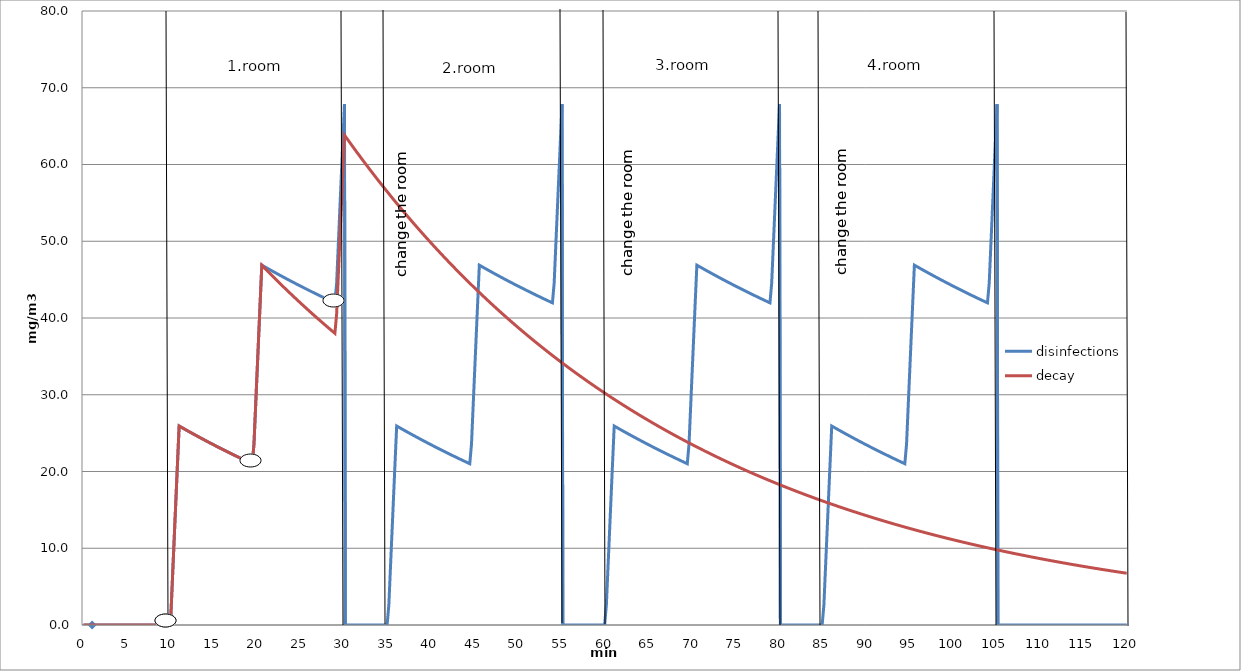
| Category | disinfections | decay |
|---|---|---|
| 0.0 | 0 | 0 |
| 0.1 | 0 | 0 |
| 0.2 | 0 | 0 |
| 0.30000000000000004 | 0 | 0 |
| 0.4 | 0 | 0 |
| 0.5 | 0 | 0 |
| 0.6 | 0 | 0 |
| 0.7 | 0 | 0 |
| 0.7999999999999999 | 0 | 0 |
| 0.8999999999999999 | 0 | 0 |
| 0.9999999999999999 | 0 | 0 |
| 1.0999999999999999 | 0 | 0 |
| 1.2 | 0 | 0 |
| 1.3 | 0 | 0 |
| 1.4000000000000001 | 0 | 0 |
| 1.5000000000000002 | 0 | 0 |
| 1.6000000000000003 | 0 | 0 |
| 1.7000000000000004 | 0 | 0 |
| 1.8000000000000005 | 0 | 0 |
| 1.9000000000000006 | 0 | 0 |
| 2.0000000000000004 | 0 | 0 |
| 2.1000000000000005 | 0 | 0 |
| 2.2000000000000006 | 0 | 0 |
| 2.3000000000000007 | 0 | 0 |
| 2.400000000000001 | 0 | 0 |
| 2.500000000000001 | 0 | 0 |
| 2.600000000000001 | 0 | 0 |
| 2.700000000000001 | 0 | 0 |
| 2.800000000000001 | 0 | 0 |
| 2.9000000000000012 | 0 | 0 |
| 3.0000000000000013 | 0 | 0 |
| 3.1000000000000014 | 0 | 0 |
| 3.2000000000000015 | 0 | 0 |
| 3.3000000000000016 | 0 | 0 |
| 3.4000000000000017 | 0 | 0 |
| 3.5000000000000018 | 0 | 0 |
| 3.600000000000002 | 0 | 0 |
| 3.700000000000002 | 0 | 0 |
| 3.800000000000002 | 0 | 0 |
| 3.900000000000002 | 0 | 0 |
| 4.000000000000002 | 0 | 0 |
| 4.100000000000001 | 0 | 0 |
| 4.200000000000001 | 0 | 0 |
| 4.300000000000001 | 0 | 0 |
| 4.4 | 0 | 0 |
| 4.5 | 0 | 0 |
| 4.6 | 0 | 0 |
| 4.699999999999999 | 0 | 0 |
| 4.799999999999999 | 0 | 0 |
| 4.899999999999999 | 0 | 0 |
| 4.999999999999998 | 0 | 0 |
| 5.099999999999998 | 0 | 0 |
| 5.1999999999999975 | 0 | 0 |
| 5.299999999999997 | 0 | 0 |
| 5.399999999999997 | 0 | 0 |
| 5.4999999999999964 | 0 | 0 |
| 5.599999999999996 | 0 | 0 |
| 5.699999999999996 | 0 | 0 |
| 5.799999999999995 | 0 | 0 |
| 5.899999999999995 | 0 | 0 |
| 5.999999999999995 | 0 | 0 |
| 6.099999999999994 | 0 | 0 |
| 6.199999999999994 | 0 | 0 |
| 6.299999999999994 | 0 | 0 |
| 6.399999999999993 | 0 | 0 |
| 6.499999999999993 | 0 | 0 |
| 6.5999999999999925 | 0 | 0 |
| 6.699999999999992 | 0 | 0 |
| 6.799999999999992 | 0 | 0 |
| 6.8999999999999915 | 0 | 0 |
| 6.999999999999991 | 0 | 0 |
| 7.099999999999991 | 0 | 0 |
| 7.19999999999999 | 0 | 0 |
| 7.29999999999999 | 0 | 0 |
| 7.39999999999999 | 0 | 0 |
| 7.499999999999989 | 0 | 0 |
| 7.599999999999989 | 0 | 0 |
| 7.699999999999989 | 0 | 0 |
| 7.799999999999988 | 0 | 0 |
| 7.899999999999988 | 0 | 0 |
| 7.999999999999988 | 0 | 0 |
| 8.099999999999987 | 0 | 0 |
| 8.199999999999987 | 0 | 0 |
| 8.299999999999986 | 0 | 0 |
| 8.399999999999986 | 0 | 0 |
| 8.499999999999986 | 0 | 0 |
| 8.599999999999985 | 0 | 0 |
| 8.699999999999985 | 0 | 0 |
| 8.799999999999985 | 0 | 0 |
| 8.899999999999984 | 0 | 0 |
| 8.999999999999984 | 0 | 0 |
| 9.099999999999984 | 0 | 0 |
| 9.199999999999983 | 0 | 0 |
| 9.299999999999983 | 0 | 0 |
| 9.399999999999983 | 0 | 0 |
| 9.499999999999982 | 0 | 0 |
| 9.599999999999982 | 0 | 0 |
| 9.699999999999982 | 0 | 0 |
| 9.799999999999981 | 0 | 0 |
| 9.89999999999998 | 0 | 0 |
| 9.99999999999998 | 0 | 0 |
| 10.09999999999998 | 2.622 | 2.622 |
| 10.19999999999998 | 5.237 | 5.237 |
| 10.29999999999998 | 7.846 | 7.846 |
| 10.399999999999979 | 10.448 | 10.448 |
| 10.499999999999979 | 13.043 | 13.043 |
| 10.599999999999978 | 15.632 | 15.632 |
| 10.699999999999978 | 18.215 | 18.215 |
| 10.799999999999978 | 20.791 | 20.791 |
| 10.899999999999977 | 23.361 | 23.361 |
| 10.999999999999977 | 25.925 | 25.925 |
| 11.099999999999977 | 25.86 | 25.86 |
| 11.199999999999976 | 25.795 | 25.795 |
| 11.299999999999976 | 25.731 | 25.731 |
| 11.399999999999975 | 25.667 | 25.667 |
| 11.499999999999975 | 25.603 | 25.603 |
| 11.599999999999975 | 25.539 | 25.539 |
| 11.699999999999974 | 25.475 | 25.475 |
| 11.799999999999974 | 25.411 | 25.411 |
| 11.899999999999974 | 25.348 | 25.348 |
| 11.999999999999973 | 25.285 | 25.285 |
| 12.099999999999973 | 25.221 | 25.221 |
| 12.199999999999973 | 25.158 | 25.158 |
| 12.299999999999972 | 25.096 | 25.096 |
| 12.399999999999972 | 25.033 | 25.033 |
| 12.499999999999972 | 24.97 | 24.97 |
| 12.599999999999971 | 24.908 | 24.908 |
| 12.69999999999997 | 24.846 | 24.846 |
| 12.79999999999997 | 24.784 | 24.784 |
| 12.89999999999997 | 24.722 | 24.722 |
| 12.99999999999997 | 24.66 | 24.66 |
| 13.09999999999997 | 24.599 | 24.599 |
| 13.199999999999969 | 24.537 | 24.537 |
| 13.299999999999969 | 24.476 | 24.476 |
| 13.399999999999968 | 24.415 | 24.415 |
| 13.499999999999968 | 24.354 | 24.354 |
| 13.599999999999968 | 24.293 | 24.293 |
| 13.699999999999967 | 24.232 | 24.232 |
| 13.799999999999967 | 24.172 | 24.172 |
| 13.899999999999967 | 24.112 | 24.112 |
| 13.999999999999966 | 24.051 | 24.051 |
| 14.099999999999966 | 23.991 | 23.991 |
| 14.199999999999966 | 23.931 | 23.931 |
| 14.299999999999965 | 23.872 | 23.872 |
| 14.399999999999965 | 23.812 | 23.812 |
| 14.499999999999964 | 23.753 | 23.753 |
| 14.599999999999964 | 23.693 | 23.693 |
| 14.699999999999964 | 23.634 | 23.634 |
| 14.799999999999963 | 23.575 | 23.575 |
| 14.899999999999963 | 23.516 | 23.516 |
| 14.999999999999963 | 23.458 | 23.458 |
| 15.099999999999962 | 23.399 | 23.399 |
| 15.199999999999962 | 23.341 | 23.341 |
| 15.299999999999962 | 23.282 | 23.282 |
| 15.399999999999961 | 23.224 | 23.224 |
| 15.499999999999961 | 23.166 | 23.166 |
| 15.59999999999996 | 23.108 | 23.108 |
| 15.69999999999996 | 23.051 | 23.051 |
| 15.79999999999996 | 22.993 | 22.993 |
| 15.89999999999996 | 22.936 | 22.936 |
| 15.99999999999996 | 22.878 | 22.878 |
| 16.09999999999996 | 22.821 | 22.821 |
| 16.19999999999996 | 22.764 | 22.764 |
| 16.29999999999996 | 22.707 | 22.707 |
| 16.399999999999963 | 22.651 | 22.651 |
| 16.499999999999964 | 22.594 | 22.594 |
| 16.599999999999966 | 22.538 | 22.538 |
| 16.699999999999967 | 22.481 | 22.481 |
| 16.79999999999997 | 22.425 | 22.425 |
| 16.89999999999997 | 22.369 | 22.369 |
| 16.99999999999997 | 22.314 | 22.314 |
| 17.099999999999973 | 22.258 | 22.258 |
| 17.199999999999974 | 22.202 | 22.202 |
| 17.299999999999976 | 22.147 | 22.147 |
| 17.399999999999977 | 22.091 | 22.091 |
| 17.49999999999998 | 22.036 | 22.036 |
| 17.59999999999998 | 21.981 | 21.981 |
| 17.69999999999998 | 21.926 | 21.926 |
| 17.799999999999983 | 21.872 | 21.872 |
| 17.899999999999984 | 21.817 | 21.817 |
| 17.999999999999986 | 21.763 | 21.763 |
| 18.099999999999987 | 21.708 | 21.708 |
| 18.19999999999999 | 21.654 | 21.654 |
| 18.29999999999999 | 21.6 | 21.6 |
| 18.39999999999999 | 21.546 | 21.546 |
| 18.499999999999993 | 21.492 | 21.492 |
| 18.599999999999994 | 21.439 | 21.439 |
| 18.699999999999996 | 21.385 | 21.385 |
| 18.799999999999997 | 21.332 | 21.332 |
| 18.9 | 21.278 | 21.278 |
| 19.0 | 21.225 | 21.225 |
| 19.1 | 21.172 | 21.172 |
| 19.200000000000003 | 21.119 | 21.119 |
| 19.300000000000004 | 21.067 | 21.067 |
| 19.400000000000006 | 21.014 | 21.014 |
| 19.500000000000007 | 20.962 | 20.962 |
| 19.60000000000001 | 23.583 | 23.583 |
| 19.70000000000001 | 26.198 | 26.198 |
| 19.80000000000001 | 28.807 | 28.807 |
| 19.900000000000013 | 31.409 | 31.409 |
| 20.000000000000014 | 34.005 | 34.005 |
| 20.100000000000016 | 36.594 | 36.594 |
| 20.200000000000017 | 39.177 | 39.177 |
| 20.30000000000002 | 41.753 | 41.753 |
| 20.40000000000002 | 44.323 | 44.323 |
| 20.50000000000002 | 46.886 | 46.886 |
| 20.600000000000023 | 46.821 | 46.769 |
| 20.700000000000024 | 46.757 | 46.652 |
| 20.800000000000026 | 46.692 | 46.536 |
| 20.900000000000027 | 46.628 | 46.42 |
| 21.00000000000003 | 46.564 | 46.304 |
| 21.10000000000003 | 46.5 | 46.188 |
| 21.20000000000003 | 46.436 | 46.073 |
| 21.300000000000033 | 46.373 | 45.958 |
| 21.400000000000034 | 46.309 | 45.843 |
| 21.500000000000036 | 46.246 | 45.729 |
| 21.600000000000037 | 46.183 | 45.614 |
| 21.70000000000004 | 46.12 | 45.5 |
| 21.80000000000004 | 46.057 | 45.387 |
| 21.90000000000004 | 45.995 | 45.274 |
| 22.000000000000043 | 45.932 | 45.161 |
| 22.100000000000044 | 45.87 | 45.048 |
| 22.200000000000045 | 45.807 | 44.935 |
| 22.300000000000047 | 45.745 | 44.823 |
| 22.40000000000005 | 45.684 | 44.711 |
| 22.50000000000005 | 45.622 | 44.6 |
| 22.60000000000005 | 45.56 | 44.488 |
| 22.700000000000053 | 45.499 | 44.377 |
| 22.800000000000054 | 45.438 | 44.266 |
| 22.900000000000055 | 45.376 | 44.156 |
| 23.000000000000057 | 45.315 | 44.045 |
| 23.10000000000006 | 45.255 | 43.936 |
| 23.20000000000006 | 45.194 | 43.826 |
| 23.30000000000006 | 45.134 | 43.716 |
| 23.400000000000063 | 45.073 | 43.607 |
| 23.500000000000064 | 45.013 | 43.498 |
| 23.600000000000065 | 44.953 | 43.39 |
| 23.700000000000067 | 44.893 | 43.281 |
| 23.800000000000068 | 44.833 | 43.173 |
| 23.90000000000007 | 44.774 | 43.066 |
| 24.00000000000007 | 44.714 | 42.958 |
| 24.100000000000072 | 44.655 | 42.851 |
| 24.200000000000074 | 44.596 | 42.744 |
| 24.300000000000075 | 44.537 | 42.637 |
| 24.400000000000077 | 44.478 | 42.531 |
| 24.500000000000078 | 44.419 | 42.424 |
| 24.60000000000008 | 44.361 | 42.318 |
| 24.70000000000008 | 44.302 | 42.213 |
| 24.800000000000082 | 44.244 | 42.107 |
| 24.900000000000084 | 44.186 | 42.002 |
| 25.000000000000085 | 44.128 | 41.897 |
| 25.100000000000087 | 44.07 | 41.793 |
| 25.200000000000088 | 44.012 | 41.688 |
| 25.30000000000009 | 43.955 | 41.584 |
| 25.40000000000009 | 43.897 | 41.48 |
| 25.500000000000092 | 43.84 | 41.377 |
| 25.600000000000094 | 43.783 | 41.274 |
| 25.700000000000095 | 43.726 | 41.171 |
| 25.800000000000097 | 43.669 | 41.068 |
| 25.900000000000098 | 43.612 | 40.965 |
| 26.0000000000001 | 43.556 | 40.863 |
| 26.1000000000001 | 43.499 | 40.761 |
| 26.200000000000102 | 43.443 | 40.659 |
| 26.300000000000104 | 43.387 | 40.558 |
| 26.400000000000105 | 43.331 | 40.456 |
| 26.500000000000107 | 43.275 | 40.355 |
| 26.600000000000108 | 43.219 | 40.255 |
| 26.70000000000011 | 43.164 | 40.154 |
| 26.80000000000011 | 43.108 | 40.054 |
| 26.900000000000112 | 43.053 | 39.954 |
| 27.000000000000114 | 42.998 | 39.854 |
| 27.100000000000115 | 42.943 | 39.755 |
| 27.200000000000117 | 42.888 | 39.655 |
| 27.300000000000118 | 42.833 | 39.556 |
| 27.40000000000012 | 42.779 | 39.457 |
| 27.50000000000012 | 42.724 | 39.359 |
| 27.600000000000122 | 42.67 | 39.261 |
| 27.700000000000124 | 42.616 | 39.163 |
| 27.800000000000125 | 42.562 | 39.065 |
| 27.900000000000126 | 42.508 | 38.967 |
| 28.000000000000128 | 42.454 | 38.87 |
| 28.10000000000013 | 42.4 | 38.773 |
| 28.20000000000013 | 42.347 | 38.676 |
| 28.300000000000132 | 42.293 | 38.58 |
| 28.400000000000134 | 42.24 | 38.483 |
| 28.500000000000135 | 42.187 | 38.387 |
| 28.600000000000136 | 42.134 | 38.291 |
| 28.700000000000138 | 42.081 | 38.196 |
| 28.80000000000014 | 42.028 | 38.1 |
| 28.90000000000014 | 41.976 | 38.005 |
| 29.000000000000142 | 41.923 | 37.91 |
| 29.100000000000144 | 44.545 | 40.532 |
| 29.200000000000145 | 47.16 | 43.147 |
| 29.300000000000146 | 49.769 | 45.756 |
| 29.400000000000148 | 52.371 | 48.358 |
| 29.50000000000015 | 54.967 | 50.954 |
| 29.60000000000015 | 57.556 | 53.543 |
| 29.700000000000152 | 60.138 | 56.125 |
| 29.800000000000153 | 62.715 | 58.702 |
| 29.900000000000155 | 65.284 | 61.272 |
| 30.000000000000156 | 67.848 | 63.835 |
| 30.100000000000158 | 0 | 63.676 |
| 30.20000000000016 | 0 | 63.517 |
| 30.30000000000016 | 0 | 63.358 |
| 30.400000000000162 | 0 | 63.2 |
| 30.500000000000163 | 0 | 63.042 |
| 30.600000000000165 | 0 | 62.885 |
| 30.700000000000166 | 0 | 62.728 |
| 30.800000000000168 | 0 | 62.571 |
| 30.90000000000017 | 0 | 62.415 |
| 31.00000000000017 | 0 | 62.259 |
| 31.100000000000172 | 0 | 62.103 |
| 31.200000000000173 | 0 | 61.948 |
| 31.300000000000175 | 0 | 61.794 |
| 31.400000000000176 | 0 | 61.639 |
| 31.500000000000178 | 0 | 61.485 |
| 31.60000000000018 | 0 | 61.332 |
| 31.70000000000018 | 0 | 61.179 |
| 31.800000000000182 | 0 | 61.026 |
| 31.900000000000183 | 0 | 60.874 |
| 32.000000000000185 | 0 | 60.722 |
| 32.100000000000186 | 0 | 60.57 |
| 32.20000000000019 | 0 | 60.419 |
| 32.30000000000019 | 0 | 60.268 |
| 32.40000000000019 | 0 | 60.117 |
| 32.50000000000019 | 0 | 59.967 |
| 32.60000000000019 | 0 | 59.818 |
| 32.700000000000195 | 0 | 59.668 |
| 32.800000000000196 | 0 | 59.519 |
| 32.9000000000002 | 0 | 59.371 |
| 33.0000000000002 | 0 | 59.222 |
| 33.1000000000002 | 0 | 59.075 |
| 33.2000000000002 | 0 | 58.927 |
| 33.3000000000002 | 0 | 58.78 |
| 33.400000000000205 | 0 | 58.633 |
| 33.500000000000206 | 0 | 58.487 |
| 33.60000000000021 | 0 | 58.341 |
| 33.70000000000021 | 0 | 58.195 |
| 33.80000000000021 | 0 | 58.05 |
| 33.90000000000021 | 0 | 57.905 |
| 34.00000000000021 | 0 | 57.76 |
| 34.100000000000215 | 0 | 57.616 |
| 34.200000000000216 | 0 | 57.472 |
| 34.30000000000022 | 0 | 57.329 |
| 34.40000000000022 | 0 | 57.185 |
| 34.50000000000022 | 0 | 57.043 |
| 34.60000000000022 | 0 | 56.9 |
| 34.70000000000022 | 0 | 56.758 |
| 34.800000000000225 | 0 | 56.616 |
| 34.900000000000226 | 0 | 56.475 |
| 35.00000000000023 | 0 | 56.334 |
| 35.10000000000023 | 2.622 | 56.193 |
| 35.20000000000023 | 5.237 | 56.053 |
| 35.30000000000023 | 7.846 | 55.913 |
| 35.40000000000023 | 10.448 | 55.774 |
| 35.500000000000234 | 13.043 | 55.634 |
| 35.600000000000236 | 15.632 | 55.495 |
| 35.70000000000024 | 18.215 | 55.357 |
| 35.80000000000024 | 20.791 | 55.219 |
| 35.90000000000024 | 23.361 | 55.081 |
| 36.00000000000024 | 25.925 | 54.943 |
| 36.10000000000024 | 25.86 | 54.806 |
| 36.200000000000244 | 25.795 | 54.669 |
| 36.300000000000246 | 25.731 | 54.533 |
| 36.40000000000025 | 25.667 | 54.397 |
| 36.50000000000025 | 25.603 | 54.261 |
| 36.60000000000025 | 25.539 | 54.125 |
| 36.70000000000025 | 25.475 | 53.99 |
| 36.80000000000025 | 25.411 | 53.855 |
| 36.900000000000254 | 25.348 | 53.721 |
| 37.000000000000256 | 25.285 | 53.587 |
| 37.10000000000026 | 25.221 | 53.453 |
| 37.20000000000026 | 25.158 | 53.319 |
| 37.30000000000026 | 25.096 | 53.186 |
| 37.40000000000026 | 25.033 | 53.053 |
| 37.50000000000026 | 24.97 | 52.921 |
| 37.600000000000264 | 24.908 | 52.789 |
| 37.700000000000266 | 24.846 | 52.657 |
| 37.80000000000027 | 24.784 | 52.526 |
| 37.90000000000027 | 24.722 | 52.394 |
| 38.00000000000027 | 24.66 | 52.264 |
| 38.10000000000027 | 24.599 | 52.133 |
| 38.20000000000027 | 24.537 | 52.003 |
| 38.300000000000274 | 24.476 | 51.873 |
| 38.400000000000276 | 24.415 | 51.744 |
| 38.50000000000028 | 24.354 | 51.614 |
| 38.60000000000028 | 24.293 | 51.485 |
| 38.70000000000028 | 24.232 | 51.357 |
| 38.80000000000028 | 24.172 | 51.229 |
| 38.90000000000028 | 24.112 | 51.101 |
| 39.000000000000284 | 24.051 | 50.973 |
| 39.100000000000286 | 23.991 | 50.846 |
| 39.20000000000029 | 23.931 | 50.719 |
| 39.30000000000029 | 23.872 | 50.592 |
| 39.40000000000029 | 23.812 | 50.466 |
| 39.50000000000029 | 23.753 | 50.34 |
| 39.60000000000029 | 23.693 | 50.214 |
| 39.700000000000294 | 23.634 | 50.089 |
| 39.800000000000296 | 23.575 | 49.964 |
| 39.9000000000003 | 23.516 | 49.839 |
| 40.0000000000003 | 23.458 | 49.715 |
| 40.1000000000003 | 23.399 | 49.591 |
| 40.2000000000003 | 23.341 | 49.467 |
| 40.3000000000003 | 23.282 | 49.343 |
| 40.400000000000304 | 23.224 | 49.22 |
| 40.500000000000306 | 23.166 | 49.097 |
| 40.60000000000031 | 23.108 | 48.975 |
| 40.70000000000031 | 23.051 | 48.852 |
| 40.80000000000031 | 22.993 | 48.73 |
| 40.90000000000031 | 22.936 | 48.609 |
| 41.00000000000031 | 22.878 | 48.487 |
| 41.100000000000314 | 22.821 | 48.366 |
| 41.200000000000315 | 22.764 | 48.245 |
| 41.30000000000032 | 22.707 | 48.125 |
| 41.40000000000032 | 22.651 | 48.005 |
| 41.50000000000032 | 22.594 | 47.885 |
| 41.60000000000032 | 22.538 | 47.765 |
| 41.70000000000032 | 22.481 | 47.646 |
| 41.800000000000324 | 22.425 | 47.527 |
| 41.900000000000325 | 22.369 | 47.408 |
| 42.00000000000033 | 22.314 | 47.29 |
| 42.10000000000033 | 22.258 | 47.172 |
| 42.20000000000033 | 22.202 | 47.054 |
| 42.30000000000033 | 22.147 | 46.937 |
| 42.40000000000033 | 22.091 | 46.82 |
| 42.500000000000334 | 22.036 | 46.703 |
| 42.600000000000335 | 21.981 | 46.586 |
| 42.70000000000034 | 21.926 | 46.47 |
| 42.80000000000034 | 21.872 | 46.354 |
| 42.90000000000034 | 21.817 | 46.238 |
| 43.00000000000034 | 21.763 | 46.122 |
| 43.10000000000034 | 21.708 | 46.007 |
| 43.200000000000344 | 21.654 | 45.892 |
| 43.300000000000345 | 21.6 | 45.778 |
| 43.40000000000035 | 21.546 | 45.664 |
| 43.50000000000035 | 21.492 | 45.55 |
| 43.60000000000035 | 21.439 | 45.436 |
| 43.70000000000035 | 21.385 | 45.322 |
| 43.80000000000035 | 21.332 | 45.209 |
| 43.900000000000354 | 21.278 | 45.096 |
| 44.000000000000355 | 21.225 | 44.984 |
| 44.10000000000036 | 21.172 | 44.871 |
| 44.20000000000036 | 21.119 | 44.759 |
| 44.30000000000036 | 21.067 | 44.648 |
| 44.40000000000036 | 21.014 | 44.536 |
| 44.50000000000036 | 20.962 | 44.425 |
| 44.600000000000364 | 23.583 | 44.314 |
| 44.700000000000365 | 26.198 | 44.203 |
| 44.80000000000037 | 28.807 | 44.093 |
| 44.90000000000037 | 31.409 | 43.983 |
| 45.00000000000037 | 34.005 | 43.873 |
| 45.10000000000037 | 36.594 | 43.763 |
| 45.20000000000037 | 39.177 | 43.654 |
| 45.300000000000374 | 41.753 | 43.545 |
| 45.400000000000375 | 44.323 | 43.436 |
| 45.50000000000038 | 46.886 | 43.328 |
| 45.60000000000038 | 46.821 | 43.22 |
| 45.70000000000038 | 46.757 | 43.112 |
| 45.80000000000038 | 46.692 | 43.004 |
| 45.90000000000038 | 46.628 | 42.897 |
| 46.000000000000384 | 46.564 | 42.79 |
| 46.100000000000385 | 46.5 | 42.683 |
| 46.20000000000039 | 46.436 | 42.576 |
| 46.30000000000039 | 46.373 | 42.47 |
| 46.40000000000039 | 46.309 | 42.364 |
| 46.50000000000039 | 46.246 | 42.258 |
| 46.60000000000039 | 46.183 | 42.153 |
| 46.700000000000394 | 46.12 | 42.048 |
| 46.800000000000395 | 46.057 | 41.943 |
| 46.9000000000004 | 45.995 | 41.838 |
| 47.0000000000004 | 45.932 | 41.733 |
| 47.1000000000004 | 45.87 | 41.629 |
| 47.2000000000004 | 45.807 | 41.525 |
| 47.3000000000004 | 45.745 | 41.422 |
| 47.400000000000404 | 45.684 | 41.318 |
| 47.500000000000405 | 45.622 | 41.215 |
| 47.600000000000406 | 45.56 | 41.112 |
| 47.70000000000041 | 45.499 | 41.009 |
| 47.80000000000041 | 45.438 | 40.907 |
| 47.90000000000041 | 45.376 | 40.805 |
| 48.00000000000041 | 45.315 | 40.703 |
| 48.10000000000041 | 45.255 | 40.601 |
| 48.200000000000415 | 45.194 | 40.5 |
| 48.300000000000416 | 45.134 | 40.399 |
| 48.40000000000042 | 45.073 | 40.298 |
| 48.50000000000042 | 45.013 | 40.197 |
| 48.60000000000042 | 44.953 | 40.097 |
| 48.70000000000042 | 44.893 | 39.997 |
| 48.80000000000042 | 44.833 | 39.897 |
| 48.900000000000425 | 44.774 | 39.797 |
| 49.000000000000426 | 44.714 | 39.698 |
| 49.10000000000043 | 44.655 | 39.599 |
| 49.20000000000043 | 44.596 | 39.5 |
| 49.30000000000043 | 44.537 | 39.401 |
| 49.40000000000043 | 44.478 | 39.303 |
| 49.50000000000043 | 44.419 | 39.205 |
| 49.600000000000435 | 44.361 | 39.107 |
| 49.700000000000436 | 44.302 | 39.009 |
| 49.80000000000044 | 44.244 | 38.912 |
| 49.90000000000044 | 44.186 | 38.815 |
| 50.00000000000044 | 44.128 | 38.718 |
| 50.10000000000044 | 44.07 | 38.621 |
| 50.20000000000044 | 44.012 | 38.525 |
| 50.300000000000445 | 43.955 | 38.429 |
| 50.400000000000446 | 43.897 | 38.333 |
| 50.50000000000045 | 43.84 | 38.237 |
| 50.60000000000045 | 43.783 | 38.141 |
| 50.70000000000045 | 43.726 | 38.046 |
| 50.80000000000045 | 43.669 | 37.951 |
| 50.90000000000045 | 43.612 | 37.856 |
| 51.000000000000455 | 43.556 | 37.762 |
| 51.100000000000456 | 43.499 | 37.668 |
| 51.20000000000046 | 43.443 | 37.574 |
| 51.30000000000046 | 43.387 | 37.48 |
| 51.40000000000046 | 43.331 | 37.386 |
| 51.50000000000046 | 43.275 | 37.293 |
| 51.60000000000046 | 43.219 | 37.2 |
| 51.700000000000465 | 43.164 | 37.107 |
| 51.800000000000466 | 43.108 | 37.014 |
| 51.90000000000047 | 43.053 | 36.922 |
| 52.00000000000047 | 42.998 | 36.83 |
| 52.10000000000047 | 42.943 | 36.738 |
| 52.20000000000047 | 42.888 | 36.646 |
| 52.30000000000047 | 42.833 | 36.554 |
| 52.400000000000475 | 42.779 | 36.463 |
| 52.500000000000476 | 42.724 | 36.372 |
| 52.60000000000048 | 42.67 | 36.281 |
| 52.70000000000048 | 42.616 | 36.191 |
| 52.80000000000048 | 42.562 | 36.1 |
| 52.90000000000048 | 42.508 | 36.01 |
| 53.00000000000048 | 42.454 | 35.92 |
| 53.100000000000485 | 42.4 | 35.831 |
| 53.200000000000486 | 42.347 | 35.741 |
| 53.30000000000049 | 42.293 | 35.652 |
| 53.40000000000049 | 42.24 | 35.563 |
| 53.50000000000049 | 42.187 | 35.474 |
| 53.60000000000049 | 42.134 | 35.385 |
| 53.70000000000049 | 42.081 | 35.297 |
| 53.800000000000495 | 42.028 | 35.209 |
| 53.900000000000496 | 41.976 | 35.121 |
| 54.0000000000005 | 41.923 | 35.033 |
| 54.1000000000005 | 44.545 | 34.946 |
| 54.2000000000005 | 47.16 | 34.859 |
| 54.3000000000005 | 49.769 | 34.772 |
| 54.4000000000005 | 52.371 | 34.685 |
| 54.500000000000504 | 54.967 | 34.598 |
| 54.600000000000506 | 57.556 | 34.512 |
| 54.70000000000051 | 60.138 | 34.426 |
| 54.80000000000051 | 62.715 | 34.34 |
| 54.90000000000051 | 65.284 | 34.254 |
| 55.00000000000051 | 67.848 | 34.168 |
| 55.10000000000051 | 0 | 34.083 |
| 55.200000000000514 | 0 | 33.998 |
| 55.300000000000516 | 0 | 33.913 |
| 55.40000000000052 | 0 | 33.828 |
| 55.50000000000052 | 0 | 33.744 |
| 55.60000000000052 | 0 | 33.66 |
| 55.70000000000052 | 0 | 33.576 |
| 55.80000000000052 | 0 | 33.492 |
| 55.900000000000524 | 0 | 33.408 |
| 56.000000000000526 | 0 | 33.325 |
| 56.10000000000053 | 0 | 33.242 |
| 56.20000000000053 | 0 | 33.159 |
| 56.30000000000053 | 0 | 33.076 |
| 56.40000000000053 | 0 | 32.993 |
| 56.50000000000053 | 0 | 32.911 |
| 56.600000000000534 | 0 | 32.829 |
| 56.700000000000536 | 0 | 32.747 |
| 56.80000000000054 | 0 | 32.665 |
| 56.90000000000054 | 0 | 32.583 |
| 57.00000000000054 | 0 | 32.502 |
| 57.10000000000054 | 0 | 32.421 |
| 57.20000000000054 | 0 | 32.34 |
| 57.300000000000544 | 0 | 32.259 |
| 57.400000000000546 | 0 | 32.179 |
| 57.50000000000055 | 0 | 32.098 |
| 57.60000000000055 | 0 | 32.018 |
| 57.70000000000055 | 0 | 31.938 |
| 57.80000000000055 | 0 | 31.858 |
| 57.90000000000055 | 0 | 31.779 |
| 58.000000000000554 | 0 | 31.699 |
| 58.100000000000556 | 0 | 31.62 |
| 58.20000000000056 | 0 | 31.541 |
| 58.30000000000056 | 0 | 31.463 |
| 58.40000000000056 | 0 | 31.384 |
| 58.50000000000056 | 0 | 31.306 |
| 58.60000000000056 | 0 | 31.228 |
| 58.700000000000564 | 0 | 31.15 |
| 58.800000000000566 | 0 | 31.072 |
| 58.90000000000057 | 0 | 30.994 |
| 59.00000000000057 | 0 | 30.917 |
| 59.10000000000057 | 0 | 30.84 |
| 59.20000000000057 | 0 | 30.763 |
| 59.30000000000057 | 0 | 30.686 |
| 59.400000000000574 | 0 | 30.609 |
| 59.500000000000576 | 0 | 30.533 |
| 59.60000000000058 | 0 | 30.457 |
| 59.70000000000058 | 0 | 30.38 |
| 59.80000000000058 | 0 | 30.305 |
| 59.90000000000058 | 0 | 30.229 |
| 60.00000000000058 | 0 | 30.153 |
| 60.100000000000584 | 2.622 | 30.078 |
| 60.200000000000585 | 5.237 | 30.003 |
| 60.30000000000059 | 7.846 | 29.928 |
| 60.40000000000059 | 10.448 | 29.853 |
| 60.50000000000059 | 13.043 | 29.779 |
| 60.60000000000059 | 15.632 | 29.705 |
| 60.70000000000059 | 18.215 | 29.63 |
| 60.800000000000594 | 20.791 | 29.556 |
| 60.900000000000595 | 23.361 | 29.483 |
| 61.0000000000006 | 25.925 | 29.409 |
| 61.1000000000006 | 25.86 | 29.336 |
| 61.2000000000006 | 25.795 | 29.262 |
| 61.3000000000006 | 25.731 | 29.189 |
| 61.4000000000006 | 25.667 | 29.116 |
| 61.500000000000604 | 25.603 | 29.044 |
| 61.600000000000605 | 25.539 | 28.971 |
| 61.70000000000061 | 25.475 | 28.899 |
| 61.80000000000061 | 25.411 | 28.827 |
| 61.90000000000061 | 25.348 | 28.755 |
| 62.00000000000061 | 25.285 | 28.683 |
| 62.10000000000061 | 25.221 | 28.611 |
| 62.200000000000614 | 25.158 | 28.54 |
| 62.300000000000615 | 25.096 | 28.469 |
| 62.40000000000062 | 25.033 | 28.397 |
| 62.50000000000062 | 24.97 | 28.327 |
| 62.60000000000062 | 24.908 | 28.256 |
| 62.70000000000062 | 24.846 | 28.185 |
| 62.80000000000062 | 24.784 | 28.115 |
| 62.900000000000624 | 24.722 | 28.045 |
| 63.000000000000625 | 24.66 | 27.975 |
| 63.10000000000063 | 24.599 | 27.905 |
| 63.20000000000063 | 24.537 | 27.835 |
| 63.30000000000063 | 24.476 | 27.766 |
| 63.40000000000063 | 24.415 | 27.696 |
| 63.50000000000063 | 24.354 | 27.627 |
| 63.600000000000634 | 24.293 | 27.558 |
| 63.700000000000635 | 24.232 | 27.489 |
| 63.80000000000064 | 24.172 | 27.421 |
| 63.90000000000064 | 24.112 | 27.352 |
| 64.00000000000064 | 24.051 | 27.284 |
| 64.10000000000063 | 23.991 | 27.216 |
| 64.20000000000063 | 23.931 | 27.148 |
| 64.30000000000062 | 23.872 | 27.08 |
| 64.40000000000062 | 23.812 | 27.013 |
| 64.50000000000061 | 23.753 | 26.945 |
| 64.6000000000006 | 23.693 | 26.878 |
| 64.7000000000006 | 23.634 | 26.811 |
| 64.8000000000006 | 23.575 | 26.744 |
| 64.90000000000059 | 23.516 | 26.677 |
| 65.00000000000058 | 23.458 | 26.61 |
| 65.10000000000058 | 23.399 | 26.544 |
| 65.20000000000057 | 23.341 | 26.478 |
| 65.30000000000057 | 23.282 | 26.412 |
| 65.40000000000056 | 23.224 | 26.346 |
| 65.50000000000055 | 23.166 | 26.28 |
| 65.60000000000055 | 23.108 | 26.214 |
| 65.70000000000054 | 23.051 | 26.149 |
| 65.80000000000054 | 22.993 | 26.083 |
| 65.90000000000053 | 22.936 | 26.018 |
| 66.00000000000053 | 22.878 | 25.953 |
| 66.10000000000052 | 22.821 | 25.889 |
| 66.20000000000051 | 22.764 | 25.824 |
| 66.30000000000051 | 22.707 | 25.759 |
| 66.4000000000005 | 22.651 | 25.695 |
| 66.5000000000005 | 22.594 | 25.631 |
| 66.60000000000049 | 22.538 | 25.567 |
| 66.70000000000049 | 22.481 | 25.503 |
| 66.80000000000048 | 22.425 | 25.439 |
| 66.90000000000047 | 22.369 | 25.376 |
| 67.00000000000047 | 22.314 | 25.313 |
| 67.10000000000046 | 22.258 | 25.249 |
| 67.20000000000046 | 22.202 | 25.186 |
| 67.30000000000045 | 22.147 | 25.123 |
| 67.40000000000045 | 22.091 | 25.061 |
| 67.50000000000044 | 22.036 | 24.998 |
| 67.60000000000043 | 21.981 | 24.936 |
| 67.70000000000043 | 21.926 | 24.873 |
| 67.80000000000042 | 21.872 | 24.811 |
| 67.90000000000042 | 21.817 | 24.749 |
| 68.00000000000041 | 21.763 | 24.688 |
| 68.1000000000004 | 21.708 | 24.626 |
| 68.2000000000004 | 21.654 | 24.564 |
| 68.3000000000004 | 21.6 | 24.503 |
| 68.40000000000039 | 21.546 | 24.442 |
| 68.50000000000038 | 21.492 | 24.381 |
| 68.60000000000038 | 21.439 | 24.32 |
| 68.70000000000037 | 21.385 | 24.259 |
| 68.80000000000037 | 21.332 | 24.199 |
| 68.90000000000036 | 21.278 | 24.138 |
| 69.00000000000036 | 21.225 | 24.078 |
| 69.10000000000035 | 21.172 | 24.018 |
| 69.20000000000034 | 21.119 | 23.958 |
| 69.30000000000034 | 21.067 | 23.898 |
| 69.40000000000033 | 21.014 | 23.838 |
| 69.50000000000033 | 20.962 | 23.779 |
| 69.60000000000032 | 23.583 | 23.72 |
| 69.70000000000032 | 26.198 | 23.66 |
| 69.80000000000031 | 28.807 | 23.601 |
| 69.9000000000003 | 31.409 | 23.542 |
| 70.0000000000003 | 34.005 | 23.484 |
| 70.10000000000029 | 36.594 | 23.425 |
| 70.20000000000029 | 39.177 | 23.366 |
| 70.30000000000028 | 41.753 | 23.308 |
| 70.40000000000028 | 44.323 | 23.25 |
| 70.50000000000027 | 46.886 | 23.192 |
| 70.60000000000026 | 46.821 | 23.134 |
| 70.70000000000026 | 46.757 | 23.076 |
| 70.80000000000025 | 46.692 | 23.019 |
| 70.90000000000025 | 46.628 | 22.961 |
| 71.00000000000024 | 46.564 | 22.904 |
| 71.10000000000024 | 46.5 | 22.847 |
| 71.20000000000023 | 46.436 | 22.79 |
| 71.30000000000022 | 46.373 | 22.733 |
| 71.40000000000022 | 46.309 | 22.676 |
| 71.50000000000021 | 46.246 | 22.619 |
| 71.60000000000021 | 46.183 | 22.563 |
| 71.7000000000002 | 46.12 | 22.506 |
| 71.8000000000002 | 46.057 | 22.45 |
| 71.90000000000019 | 45.995 | 22.394 |
| 72.00000000000018 | 45.932 | 22.338 |
| 72.10000000000018 | 45.87 | 22.282 |
| 72.20000000000017 | 45.807 | 22.227 |
| 72.30000000000017 | 45.745 | 22.171 |
| 72.40000000000016 | 45.684 | 22.116 |
| 72.50000000000016 | 45.622 | 22.061 |
| 72.60000000000015 | 45.56 | 22.006 |
| 72.70000000000014 | 45.499 | 21.951 |
| 72.80000000000014 | 45.438 | 21.896 |
| 72.90000000000013 | 45.376 | 21.841 |
| 73.00000000000013 | 45.315 | 21.787 |
| 73.10000000000012 | 45.255 | 21.732 |
| 73.20000000000012 | 45.194 | 21.678 |
| 73.30000000000011 | 45.134 | 21.624 |
| 73.4000000000001 | 45.073 | 21.57 |
| 73.5000000000001 | 45.013 | 21.516 |
| 73.6000000000001 | 44.953 | 21.462 |
| 73.70000000000009 | 44.893 | 21.409 |
| 73.80000000000008 | 44.833 | 21.355 |
| 73.90000000000008 | 44.774 | 21.302 |
| 74.00000000000007 | 44.714 | 21.249 |
| 74.10000000000007 | 44.655 | 21.196 |
| 74.20000000000006 | 44.596 | 21.143 |
| 74.30000000000005 | 44.537 | 21.09 |
| 74.40000000000005 | 44.478 | 21.037 |
| 74.50000000000004 | 44.419 | 20.985 |
| 74.60000000000004 | 44.361 | 20.932 |
| 74.70000000000003 | 44.302 | 20.88 |
| 74.80000000000003 | 44.244 | 20.828 |
| 74.90000000000002 | 44.186 | 20.776 |
| 75.00000000000001 | 44.128 | 20.724 |
| 75.10000000000001 | 44.07 | 20.672 |
| 75.2 | 44.012 | 20.621 |
| 75.3 | 43.955 | 20.569 |
| 75.39999999999999 | 43.897 | 20.518 |
| 75.49999999999999 | 43.84 | 20.467 |
| 75.59999999999998 | 43.783 | 20.416 |
| 75.69999999999997 | 43.726 | 20.365 |
| 75.79999999999997 | 43.669 | 20.314 |
| 75.89999999999996 | 43.612 | 20.263 |
| 75.99999999999996 | 43.556 | 20.212 |
| 76.09999999999995 | 43.499 | 20.162 |
| 76.19999999999995 | 43.443 | 20.112 |
| 76.29999999999994 | 43.387 | 20.061 |
| 76.39999999999993 | 43.331 | 20.011 |
| 76.49999999999993 | 43.275 | 19.961 |
| 76.59999999999992 | 43.219 | 19.912 |
| 76.69999999999992 | 43.164 | 19.862 |
| 76.79999999999991 | 43.108 | 19.812 |
| 76.8999999999999 | 43.053 | 19.763 |
| 76.9999999999999 | 42.998 | 19.713 |
| 77.0999999999999 | 42.943 | 19.664 |
| 77.19999999999989 | 42.888 | 19.615 |
| 77.29999999999988 | 42.833 | 19.566 |
| 77.39999999999988 | 42.779 | 19.517 |
| 77.49999999999987 | 42.724 | 19.469 |
| 77.59999999999987 | 42.67 | 19.42 |
| 77.69999999999986 | 42.616 | 19.371 |
| 77.79999999999986 | 42.562 | 19.323 |
| 77.89999999999985 | 42.508 | 19.275 |
| 77.99999999999984 | 42.454 | 19.227 |
| 78.09999999999984 | 42.4 | 19.179 |
| 78.19999999999983 | 42.347 | 19.131 |
| 78.29999999999983 | 42.293 | 19.083 |
| 78.39999999999982 | 42.24 | 19.035 |
| 78.49999999999982 | 42.187 | 18.988 |
| 78.59999999999981 | 42.134 | 18.94 |
| 78.6999999999998 | 42.081 | 18.893 |
| 78.7999999999998 | 42.028 | 18.846 |
| 78.89999999999979 | 41.976 | 18.799 |
| 78.99999999999979 | 41.923 | 18.752 |
| 79.09999999999978 | 44.545 | 18.705 |
| 79.19999999999978 | 47.16 | 18.658 |
| 79.29999999999977 | 49.769 | 18.612 |
| 79.39999999999976 | 52.371 | 18.565 |
| 79.49999999999976 | 54.967 | 18.519 |
| 79.59999999999975 | 57.556 | 18.473 |
| 79.69999999999975 | 60.138 | 18.427 |
| 79.79999999999974 | 62.715 | 18.381 |
| 79.89999999999974 | 65.284 | 18.335 |
| 79.99999999999973 | 67.848 | 18.289 |
| 80.09999999999972 | 0 | 18.243 |
| 80.19999999999972 | 0 | 18.198 |
| 80.29999999999971 | 0 | 18.152 |
| 80.39999999999971 | 0 | 18.107 |
| 80.4999999999997 | 0 | 18.062 |
| 80.5999999999997 | 0 | 18.017 |
| 80.69999999999969 | 0 | 17.972 |
| 80.79999999999968 | 0 | 17.927 |
| 80.89999999999968 | 0 | 17.882 |
| 80.99999999999967 | 0 | 17.837 |
| 81.09999999999967 | 0 | 17.793 |
| 81.19999999999966 | 0 | 17.748 |
| 81.29999999999966 | 0 | 17.704 |
| 81.39999999999965 | 0 | 17.66 |
| 81.49999999999964 | 0 | 17.616 |
| 81.59999999999964 | 0 | 17.572 |
| 81.69999999999963 | 0 | 17.528 |
| 81.79999999999963 | 0 | 17.484 |
| 81.89999999999962 | 0 | 17.441 |
| 81.99999999999962 | 0 | 17.397 |
| 82.09999999999961 | 0 | 17.354 |
| 82.1999999999996 | 0 | 17.31 |
| 82.2999999999996 | 0 | 17.267 |
| 82.3999999999996 | 0 | 17.224 |
| 82.49999999999959 | 0 | 17.181 |
| 82.59999999999958 | 0 | 17.138 |
| 82.69999999999958 | 0 | 17.095 |
| 82.79999999999957 | 0 | 17.053 |
| 82.89999999999957 | 0 | 17.01 |
| 82.99999999999956 | 0 | 16.968 |
| 83.09999999999955 | 0 | 16.925 |
| 83.19999999999955 | 0 | 16.883 |
| 83.29999999999954 | 0 | 16.841 |
| 83.39999999999954 | 0 | 16.799 |
| 83.49999999999953 | 0 | 16.757 |
| 83.59999999999953 | 0 | 16.715 |
| 83.69999999999952 | 0 | 16.673 |
| 83.79999999999951 | 0 | 16.632 |
| 83.89999999999951 | 0 | 16.59 |
| 83.9999999999995 | 0 | 16.549 |
| 84.0999999999995 | 0 | 16.507 |
| 84.19999999999949 | 0 | 16.466 |
| 84.29999999999949 | 0 | 16.425 |
| 84.39999999999948 | 0 | 16.384 |
| 84.49999999999947 | 0 | 16.343 |
| 84.59999999999947 | 0 | 16.302 |
| 84.69999999999946 | 0 | 16.261 |
| 84.79999999999946 | 0 | 16.221 |
| 84.89999999999945 | 0 | 16.18 |
| 84.99999999999945 | 0 | 16.14 |
| 85.09999999999944 | 2.622 | 16.1 |
| 85.19999999999943 | 5.237 | 16.059 |
| 85.29999999999943 | 7.846 | 16.019 |
| 85.39999999999942 | 10.448 | 15.979 |
| 85.49999999999942 | 13.043 | 15.939 |
| 85.59999999999941 | 15.632 | 15.9 |
| 85.6999999999994 | 18.215 | 15.86 |
| 85.7999999999994 | 20.791 | 15.82 |
| 85.8999999999994 | 23.361 | 15.781 |
| 85.99999999999939 | 25.925 | 15.741 |
| 86.09999999999938 | 25.86 | 15.702 |
| 86.19999999999938 | 25.795 | 15.663 |
| 86.29999999999937 | 25.731 | 15.624 |
| 86.39999999999937 | 25.667 | 15.585 |
| 86.49999999999936 | 25.603 | 15.546 |
| 86.59999999999935 | 25.539 | 15.507 |
| 86.69999999999935 | 25.475 | 15.468 |
| 86.79999999999934 | 25.411 | 15.43 |
| 86.89999999999934 | 25.348 | 15.391 |
| 86.99999999999933 | 25.285 | 15.353 |
| 87.09999999999933 | 25.221 | 15.314 |
| 87.19999999999932 | 25.158 | 15.276 |
| 87.29999999999932 | 25.096 | 15.238 |
| 87.39999999999931 | 25.033 | 15.2 |
| 87.4999999999993 | 24.97 | 15.162 |
| 87.5999999999993 | 24.908 | 15.124 |
| 87.69999999999929 | 24.846 | 15.086 |
| 87.79999999999929 | 24.784 | 15.049 |
| 87.89999999999928 | 24.722 | 15.011 |
| 87.99999999999928 | 24.66 | 14.974 |
| 88.09999999999927 | 24.599 | 14.936 |
| 88.19999999999926 | 24.537 | 14.899 |
| 88.29999999999926 | 24.476 | 14.862 |
| 88.39999999999925 | 24.415 | 14.825 |
| 88.49999999999925 | 24.354 | 14.788 |
| 88.59999999999924 | 24.293 | 14.751 |
| 88.69999999999924 | 24.232 | 14.714 |
| 88.79999999999923 | 24.172 | 14.677 |
| 88.89999999999922 | 24.112 | 14.641 |
| 88.99999999999922 | 24.051 | 14.604 |
| 89.09999999999921 | 23.991 | 14.568 |
| 89.1999999999992 | 23.931 | 14.531 |
| 89.2999999999992 | 23.872 | 14.495 |
| 89.3999999999992 | 23.812 | 14.459 |
| 89.49999999999919 | 23.753 | 14.423 |
| 89.59999999999918 | 23.693 | 14.387 |
| 89.69999999999918 | 23.634 | 14.351 |
| 89.79999999999917 | 23.575 | 14.315 |
| 89.89999999999917 | 23.516 | 14.279 |
| 89.99999999999916 | 23.458 | 14.243 |
| 90.09999999999916 | 23.399 | 14.208 |
| 90.19999999999915 | 23.341 | 14.172 |
| 90.29999999999914 | 23.282 | 14.137 |
| 90.39999999999914 | 23.224 | 14.102 |
| 90.49999999999913 | 23.166 | 14.067 |
| 90.59999999999913 | 23.108 | 14.031 |
| 90.69999999999912 | 23.051 | 13.996 |
| 90.79999999999912 | 22.993 | 13.961 |
| 90.89999999999911 | 22.936 | 13.927 |
| 90.9999999999991 | 22.878 | 13.892 |
| 91.0999999999991 | 22.821 | 13.857 |
| 91.1999999999991 | 22.764 | 13.823 |
| 91.29999999999909 | 22.707 | 13.788 |
| 91.39999999999908 | 22.651 | 13.754 |
| 91.49999999999908 | 22.594 | 13.719 |
| 91.59999999999907 | 22.538 | 13.685 |
| 91.69999999999906 | 22.481 | 13.651 |
| 91.79999999999906 | 22.425 | 13.617 |
| 91.89999999999905 | 22.369 | 13.583 |
| 91.99999999999905 | 22.314 | 13.549 |
| 92.09999999999904 | 22.258 | 13.515 |
| 92.19999999999904 | 22.202 | 13.481 |
| 92.29999999999903 | 22.147 | 13.448 |
| 92.39999999999903 | 22.091 | 13.414 |
| 92.49999999999902 | 22.036 | 13.381 |
| 92.59999999999901 | 21.981 | 13.347 |
| 92.69999999999901 | 21.926 | 13.314 |
| 92.799999999999 | 21.872 | 13.281 |
| 92.899999999999 | 21.817 | 13.247 |
| 92.99999999999899 | 21.763 | 13.214 |
| 93.09999999999899 | 21.708 | 13.181 |
| 93.19999999999898 | 21.654 | 13.148 |
| 93.29999999999897 | 21.6 | 13.116 |
| 93.39999999999897 | 21.546 | 13.083 |
| 93.49999999999896 | 21.492 | 13.05 |
| 93.59999999999896 | 21.439 | 13.018 |
| 93.69999999999895 | 21.385 | 12.985 |
| 93.79999999999895 | 21.332 | 12.953 |
| 93.89999999999894 | 21.278 | 12.92 |
| 93.99999999999893 | 21.225 | 12.888 |
| 94.09999999999893 | 21.172 | 12.856 |
| 94.19999999999892 | 21.119 | 12.824 |
| 94.29999999999892 | 21.067 | 12.792 |
| 94.39999999999891 | 21.014 | 12.76 |
| 94.4999999999989 | 20.962 | 12.728 |
| 94.5999999999989 | 23.583 | 12.696 |
| 94.6999999999989 | 26.198 | 12.664 |
| 94.79999999999889 | 28.807 | 12.633 |
| 94.89999999999888 | 31.409 | 12.601 |
| 94.99999999999888 | 34.005 | 12.57 |
| 95.09999999999887 | 36.594 | 12.538 |
| 95.19999999999887 | 39.177 | 12.507 |
| 95.29999999999886 | 41.753 | 12.476 |
| 95.39999999999885 | 44.323 | 12.445 |
| 95.49999999999885 | 46.886 | 12.414 |
| 95.59999999999884 | 46.821 | 12.383 |
| 95.69999999999884 | 46.757 | 12.352 |
| 95.79999999999883 | 46.692 | 12.321 |
| 95.89999999999883 | 46.628 | 12.29 |
| 95.99999999999882 | 46.564 | 12.259 |
| 96.09999999999881 | 46.5 | 12.229 |
| 96.19999999999881 | 46.436 | 12.198 |
| 96.2999999999988 | 46.373 | 12.168 |
| 96.3999999999988 | 46.309 | 12.138 |
| 96.49999999999879 | 46.246 | 12.107 |
| 96.59999999999879 | 46.183 | 12.077 |
| 96.69999999999878 | 46.12 | 12.047 |
| 96.79999999999878 | 46.057 | 12.017 |
| 96.89999999999877 | 45.995 | 11.987 |
| 96.99999999999876 | 45.932 | 11.957 |
| 97.09999999999876 | 45.87 | 11.927 |
| 97.19999999999875 | 45.807 | 11.897 |
| 97.29999999999875 | 45.745 | 11.867 |
| 97.39999999999874 | 45.684 | 11.838 |
| 97.49999999999874 | 45.622 | 11.808 |
| 97.59999999999873 | 45.56 | 11.779 |
| 97.69999999999872 | 45.499 | 11.749 |
| 97.79999999999872 | 45.438 | 11.72 |
| 97.89999999999871 | 45.376 | 11.691 |
| 97.9999999999987 | 45.315 | 11.662 |
| 98.0999999999987 | 45.255 | 11.632 |
| 98.1999999999987 | 45.194 | 11.603 |
| 98.29999999999869 | 45.134 | 11.574 |
| 98.39999999999868 | 45.073 | 11.546 |
| 98.49999999999868 | 45.013 | 11.517 |
| 98.59999999999867 | 44.953 | 11.488 |
| 98.69999999999867 | 44.893 | 11.459 |
| 98.79999999999866 | 44.833 | 11.431 |
| 98.89999999999866 | 44.774 | 11.402 |
| 98.99999999999865 | 44.714 | 11.374 |
| 99.09999999999864 | 44.655 | 11.345 |
| 99.19999999999864 | 44.596 | 11.317 |
| 99.29999999999863 | 44.537 | 11.289 |
| 99.39999999999863 | 44.478 | 11.26 |
| 99.49999999999862 | 44.419 | 11.232 |
| 99.59999999999862 | 44.361 | 11.204 |
| 99.69999999999861 | 44.302 | 11.176 |
| 99.7999999999986 | 44.244 | 11.148 |
| 99.8999999999986 | 44.186 | 11.121 |
| 99.9999999999986 | 44.128 | 11.093 |
| 100.09999999999859 | 44.07 | 11.065 |
| 100.19999999999858 | 44.012 | 11.038 |
| 100.29999999999858 | 43.955 | 11.01 |
| 100.39999999999857 | 43.897 | 10.982 |
| 100.49999999999856 | 43.84 | 10.955 |
| 100.59999999999856 | 43.783 | 10.928 |
| 100.69999999999855 | 43.726 | 10.9 |
| 100.79999999999855 | 43.669 | 10.873 |
| 100.89999999999854 | 43.612 | 10.846 |
| 100.99999999999854 | 43.556 | 10.819 |
| 101.09999999999853 | 43.499 | 10.792 |
| 101.19999999999852 | 43.443 | 10.765 |
| 101.29999999999852 | 43.387 | 10.738 |
| 101.39999999999851 | 43.331 | 10.711 |
| 101.49999999999851 | 43.275 | 10.685 |
| 101.5999999999985 | 43.219 | 10.658 |
| 101.6999999999985 | 43.164 | 10.631 |
| 101.79999999999849 | 43.108 | 10.605 |
| 101.89999999999849 | 43.053 | 10.578 |
| 101.99999999999848 | 42.998 | 10.552 |
| 102.09999999999847 | 42.943 | 10.525 |
| 102.19999999999847 | 42.888 | 10.499 |
| 102.29999999999846 | 42.833 | 10.473 |
| 102.39999999999846 | 42.779 | 10.447 |
| 102.49999999999845 | 42.724 | 10.421 |
| 102.59999999999845 | 42.67 | 10.395 |
| 102.69999999999844 | 42.616 | 10.369 |
| 102.79999999999843 | 42.562 | 10.343 |
| 102.89999999999843 | 42.508 | 10.317 |
| 102.99999999999842 | 42.454 | 10.291 |
| 103.09999999999842 | 42.4 | 10.266 |
| 103.19999999999841 | 42.347 | 10.24 |
| 103.2999999999984 | 42.293 | 10.214 |
| 103.3999999999984 | 42.24 | 10.189 |
| 103.4999999999984 | 42.187 | 10.163 |
| 103.59999999999839 | 42.134 | 10.138 |
| 103.69999999999838 | 42.081 | 10.113 |
| 103.79999999999838 | 42.028 | 10.088 |
| 103.89999999999837 | 41.976 | 10.062 |
| 103.99999999999837 | 41.923 | 10.037 |
| 104.09999999999836 | 44.545 | 10.012 |
| 104.19999999999835 | 47.16 | 9.987 |
| 104.29999999999835 | 49.769 | 9.962 |
| 104.39999999999834 | 52.371 | 9.937 |
| 104.49999999999834 | 54.967 | 9.913 |
| 104.59999999999833 | 57.556 | 9.888 |
| 104.69999999999833 | 60.138 | 9.863 |
| 104.79999999999832 | 62.715 | 9.838 |
| 104.89999999999831 | 65.284 | 9.814 |
| 104.99999999999831 | 67.848 | 9.789 |
| 105.0999999999983 | 0 | 9.765 |
| 105.1999999999983 | 0 | 9.741 |
| 105.29999999999829 | 0 | 9.716 |
| 105.39999999999829 | 0 | 9.692 |
| 105.49999999999828 | 0 | 9.668 |
| 105.59999999999827 | 0 | 9.644 |
| 105.69999999999827 | 0 | 9.62 |
| 105.79999999999826 | 0 | 9.596 |
| 105.89999999999826 | 0 | 9.572 |
| 105.99999999999825 | 0 | 9.548 |
| 106.09999999999825 | 0 | 9.524 |
| 106.19999999999824 | 0 | 9.5 |
| 106.29999999999824 | 0 | 9.476 |
| 106.39999999999823 | 0 | 9.453 |
| 106.49999999999822 | 0 | 9.429 |
| 106.59999999999822 | 0 | 9.406 |
| 106.69999999999821 | 0 | 9.382 |
| 106.7999999999982 | 0 | 9.359 |
| 106.8999999999982 | 0 | 9.335 |
| 106.9999999999982 | 0 | 9.312 |
| 107.09999999999819 | 0 | 9.289 |
| 107.19999999999818 | 0 | 9.266 |
| 107.29999999999818 | 0 | 9.242 |
| 107.39999999999817 | 0 | 9.219 |
| 107.49999999999817 | 0 | 9.196 |
| 107.59999999999816 | 0 | 9.173 |
| 107.69999999999816 | 0 | 9.15 |
| 107.79999999999815 | 0 | 9.128 |
| 107.89999999999814 | 0 | 9.105 |
| 107.99999999999814 | 0 | 9.082 |
| 108.09999999999813 | 0 | 9.059 |
| 108.19999999999813 | 0 | 9.037 |
| 108.29999999999812 | 0 | 9.014 |
| 108.39999999999812 | 0 | 8.992 |
| 108.49999999999811 | 0 | 8.969 |
| 108.5999999999981 | 0 | 8.947 |
| 108.6999999999981 | 0 | 8.924 |
| 108.7999999999981 | 0 | 8.902 |
| 108.89999999999809 | 0 | 8.88 |
| 108.99999999999808 | 0 | 8.858 |
| 109.09999999999808 | 0 | 8.836 |
| 109.19999999999807 | 0 | 8.814 |
| 109.29999999999806 | 0 | 8.792 |
| 109.39999999999806 | 0 | 8.77 |
| 109.49999999999805 | 0 | 8.748 |
| 109.59999999999805 | 0 | 8.726 |
| 109.69999999999804 | 0 | 8.704 |
| 109.79999999999804 | 0 | 8.682 |
| 109.89999999999803 | 0 | 8.661 |
| 109.99999999999802 | 0 | 8.639 |
| 110.09999999999802 | 0 | 8.618 |
| 110.19999999999801 | 0 | 8.596 |
| 110.29999999999801 | 0 | 8.575 |
| 110.399999999998 | 0 | 8.553 |
| 110.499999999998 | 0 | 8.532 |
| 110.59999999999799 | 0 | 8.51 |
| 110.69999999999798 | 0 | 8.489 |
| 110.79999999999798 | 0 | 8.468 |
| 110.89999999999797 | 0 | 8.447 |
| 110.99999999999797 | 0 | 8.426 |
| 111.09999999999796 | 0 | 8.405 |
| 111.19999999999796 | 0 | 8.384 |
| 111.29999999999795 | 0 | 8.363 |
| 111.39999999999795 | 0 | 8.342 |
| 111.49999999999794 | 0 | 8.321 |
| 111.59999999999793 | 0 | 8.3 |
| 111.69999999999793 | 0 | 8.28 |
| 111.79999999999792 | 0 | 8.259 |
| 111.89999999999792 | 0 | 8.238 |
| 111.99999999999791 | 0 | 8.218 |
| 112.0999999999979 | 0 | 8.197 |
| 112.1999999999979 | 0 | 8.177 |
| 112.2999999999979 | 0 | 8.156 |
| 112.39999999999789 | 0 | 8.136 |
| 112.49999999999788 | 0 | 8.116 |
| 112.59999999999788 | 0 | 8.095 |
| 112.69999999999787 | 0 | 8.075 |
| 112.79999999999787 | 0 | 8.055 |
| 112.89999999999786 | 0 | 8.035 |
| 112.99999999999785 | 0 | 8.015 |
| 113.09999999999785 | 0 | 7.995 |
| 113.19999999999784 | 0 | 7.975 |
| 113.29999999999784 | 0 | 7.955 |
| 113.39999999999783 | 0 | 7.935 |
| 113.49999999999783 | 0 | 7.915 |
| 113.59999999999782 | 0 | 7.896 |
| 113.69999999999781 | 0 | 7.876 |
| 113.79999999999781 | 0 | 7.856 |
| 113.8999999999978 | 0 | 7.837 |
| 113.9999999999978 | 0 | 7.817 |
| 114.09999999999779 | 0 | 7.797 |
| 114.19999999999779 | 0 | 7.778 |
| 114.29999999999778 | 0 | 7.759 |
| 114.39999999999777 | 0 | 7.739 |
| 114.49999999999777 | 0 | 7.72 |
| 114.59999999999776 | 0 | 7.701 |
| 114.69999999999776 | 0 | 7.681 |
| 114.79999999999775 | 0 | 7.662 |
| 114.89999999999775 | 0 | 7.643 |
| 114.99999999999774 | 0 | 7.624 |
| 115.09999999999773 | 0 | 7.605 |
| 115.19999999999773 | 0 | 7.586 |
| 115.29999999999772 | 0 | 7.567 |
| 115.39999999999772 | 0 | 7.548 |
| 115.49999999999771 | 0 | 7.529 |
| 115.5999999999977 | 0 | 7.51 |
| 115.6999999999977 | 0 | 7.492 |
| 115.7999999999977 | 0 | 7.473 |
| 115.89999999999769 | 0 | 7.454 |
| 115.99999999999768 | 0 | 7.436 |
| 116.09999999999768 | 0 | 7.417 |
| 116.19999999999767 | 0 | 7.399 |
| 116.29999999999767 | 0 | 7.38 |
| 116.39999999999766 | 0 | 7.362 |
| 116.49999999999766 | 0 | 7.343 |
| 116.59999999999765 | 0 | 7.325 |
| 116.69999999999764 | 0 | 7.307 |
| 116.79999999999764 | 0 | 7.289 |
| 116.89999999999763 | 0 | 7.27 |
| 116.99999999999763 | 0 | 7.252 |
| 117.09999999999762 | 0 | 7.234 |
| 117.19999999999762 | 0 | 7.216 |
| 117.29999999999761 | 0 | 7.198 |
| 117.3999999999976 | 0 | 7.18 |
| 117.4999999999976 | 0 | 7.162 |
| 117.59999999999759 | 0 | 7.144 |
| 117.69999999999759 | 0 | 7.126 |
| 117.79999999999758 | 0 | 7.109 |
| 117.89999999999758 | 0 | 7.091 |
| 117.99999999999757 | 0 | 7.073 |
| 118.09999999999756 | 0 | 7.055 |
| 118.19999999999756 | 0 | 7.038 |
| 118.29999999999755 | 0 | 7.02 |
| 118.39999999999755 | 0 | 7.003 |
| 118.49999999999754 | 0 | 6.985 |
| 118.59999999999754 | 0 | 6.968 |
| 118.69999999999753 | 0 | 6.95 |
| 118.79999999999752 | 0 | 6.933 |
| 118.89999999999752 | 0 | 6.916 |
| 118.99999999999751 | 0 | 6.898 |
| 119.09999999999751 | 0 | 6.881 |
| 119.1999999999975 | 0 | 6.864 |
| 119.2999999999975 | 0 | 6.847 |
| 119.39999999999749 | 0 | 6.83 |
| 119.49999999999748 | 0 | 6.813 |
| 119.59999999999748 | 0 | 6.796 |
| 119.69999999999747 | 0 | 6.779 |
| 119.79999999999747 | 0 | 6.762 |
| 119.89999999999746 | 0 | 6.745 |
| 119.99999999999746 | 0 | 6.728 |